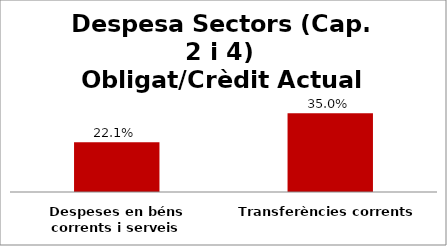
| Category | Series 0 |
|---|---|
| Despeses en béns corrents i serveis | 0.221 |
| Transferències corrents | 0.35 |